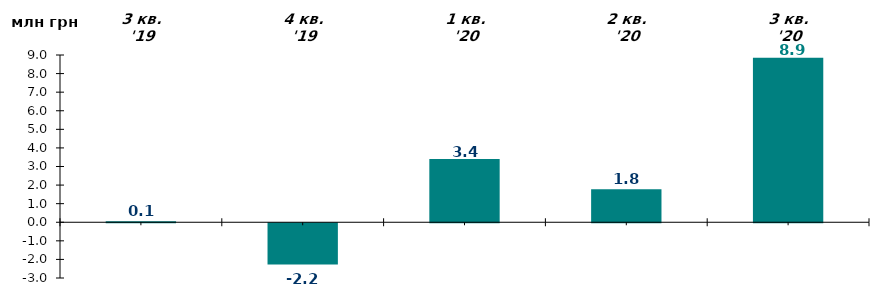
| Category | Чистий притік/відтік за відповідний квартал, млн грн |
|---|---|
| 3 кв. '19 | 0.05 |
| 4 кв. '19 | -2.22 |
| 1 кв. '20 | 3.4 |
| 2 кв. '20 | 1.78 |
| 3 кв. '20 | 8.85 |